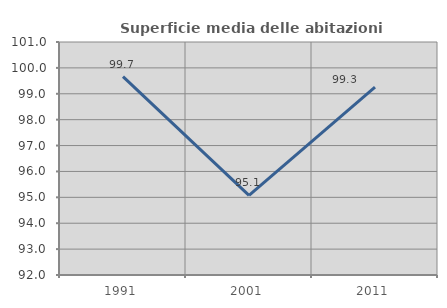
| Category | Superficie media delle abitazioni occupate |
|---|---|
| 1991.0 | 99.661 |
| 2001.0 | 95.072 |
| 2011.0 | 99.258 |